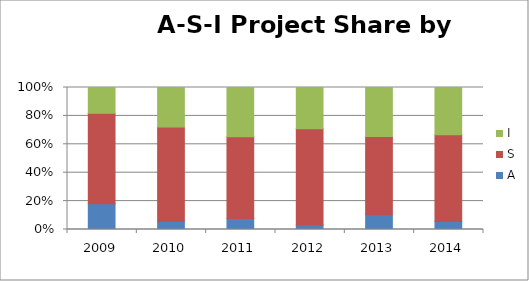
| Category | A | S | I |
|---|---|---|---|
| 2009.0 | 2 | 7 | 2 |
| 2010.0 | 1 | 12 | 5 |
| 2011.0 | 2 | 15 | 9 |
| 2012.0 | 1 | 21 | 9 |
| 2013.0 | 3 | 16 | 10 |
| 2014.0 | 1 | 11 | 6 |